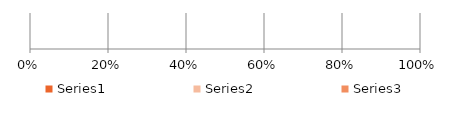
| Category | Series 0 | Series 1 | Series 2 |
|---|---|---|---|
| 0 | 54437.095 | 31404.95 | 9072.727 |